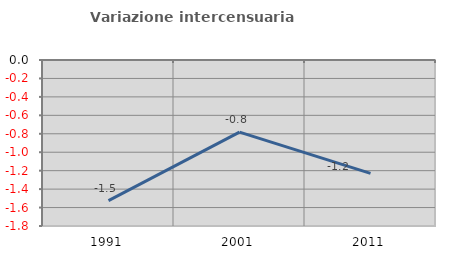
| Category | Variazione intercensuaria annua |
|---|---|
| 1991.0 | -1.524 |
| 2001.0 | -0.782 |
| 2011.0 | -1.229 |